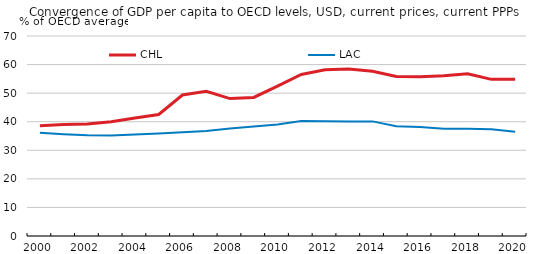
| Category | CHL | LAC |
|---|---|---|
| 2000.0 | 38.578 | 36.119 |
| 2001.0 | 39.06 | 35.588 |
| 2002.0 | 39.227 | 35.235 |
| 2003.0 | 39.977 | 35.19 |
| 2004.0 | 41.335 | 35.565 |
| 2005.0 | 42.527 | 35.841 |
| 2006.0 | 49.351 | 36.285 |
| 2007.0 | 50.62 | 36.787 |
| 2008.0 | 48.102 | 37.625 |
| 2009.0 | 48.503 | 38.366 |
| 2010.0 | 52.489 | 39.066 |
| 2011.0 | 56.523 | 40.26 |
| 2012.0 | 58.151 | 40.179 |
| 2013.0 | 58.47 | 40.048 |
| 2014.0 | 57.668 | 40.113 |
| 2015.0 | 55.856 | 38.386 |
| 2016.0 | 55.746 | 38.117 |
| 2017.0 | 56.114 | 37.578 |
| 2018.0 | 56.777 | 37.534 |
| 2019.0 | 54.822 | 37.382 |
| 2020.0 | 54.833 | 36.481 |